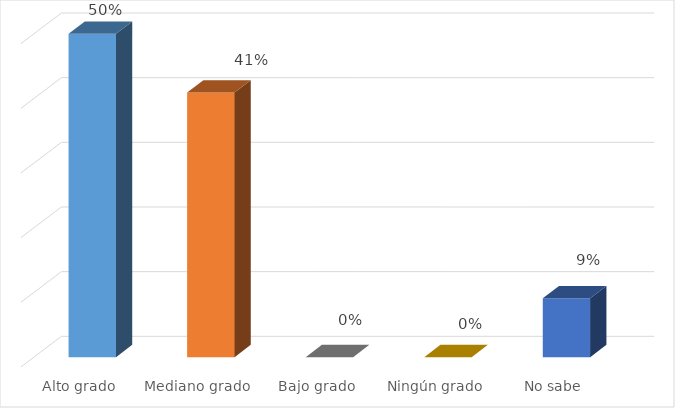
| Category | Series 0 |
|---|---|
| Alto grado | 0.5 |
| Mediano grado | 0.409 |
| Bajo grado | 0 |
| Ningún grado | 0 |
| No sabe | 0.091 |